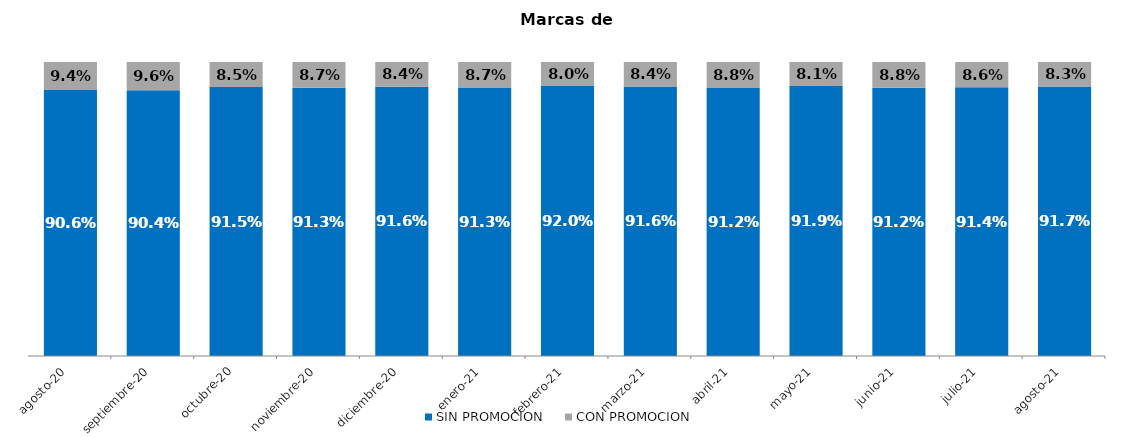
| Category | SIN PROMOCION   | CON PROMOCION   |
|---|---|---|
| 2020-08-01 | 0.906 | 0.094 |
| 2020-09-01 | 0.904 | 0.096 |
| 2020-10-01 | 0.915 | 0.085 |
| 2020-11-01 | 0.913 | 0.087 |
| 2020-12-01 | 0.916 | 0.084 |
| 2021-01-01 | 0.913 | 0.087 |
| 2021-02-01 | 0.92 | 0.08 |
| 2021-03-01 | 0.916 | 0.084 |
| 2021-04-01 | 0.912 | 0.088 |
| 2021-05-01 | 0.919 | 0.081 |
| 2021-06-01 | 0.912 | 0.088 |
| 2021-07-01 | 0.914 | 0.086 |
| 2021-08-01 | 0.917 | 0.083 |